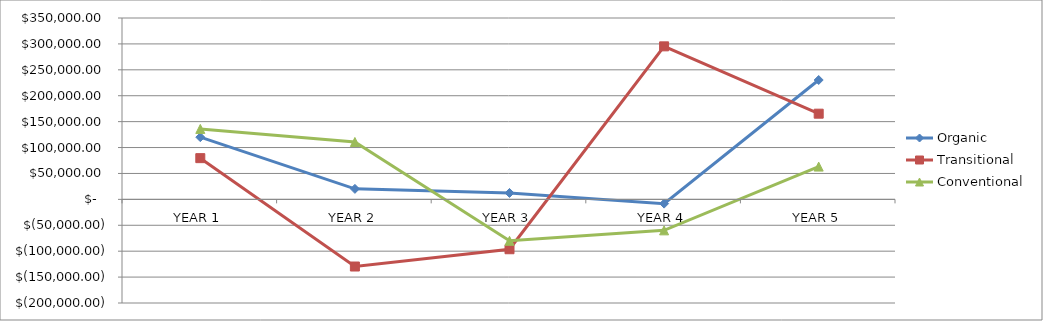
| Category | Organic | Transitional | Conventional |
|---|---|---|---|
| YEAR 1 | 120026.086 | 79526.086 | 135914.655 |
| YEAR 2 | 20260.401 | -129596.982 | 110748.583 |
| YEAR 3 | 12365.757 | -96259.243 | -79996.147 |
| YEAR 4 | -8223.854 | 295300.195 | -59802.168 |
| YEAR 5 | 230341.208 | 165341.208 | 63243.466 |